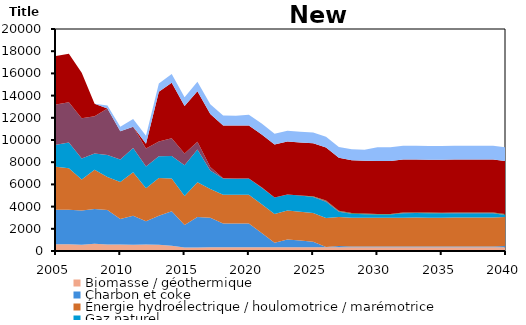
| Category | Biomasse / géothermique | Charbon et coke | Énergie hydroélectrique / houlomotrice / marémotrice | Gaz naturel | Pétrole | Solaire | Uranium | Éolien |
|---|---|---|---|---|---|---|---|---|
| 2005.0 | 610 | 3101.052 | 3875 | 1980 | 3622.764 | 0 | 4378 | 0 |
| 2006.0 | 610 | 3107.928 | 3731 | 2332 | 3622.788 | 0 | 4366 | 0 |
| 2007.0 | 562 | 3093.977 | 2793.761 | 1876 | 3622.739 | 0 | 4119 | 0 |
| 2008.0 | 647 | 3127.393 | 3536.094 | 1483 | 3341.973 | 0 | 1129 | 0 |
| 2009.0 | 576 | 3123.341 | 2964.241 | 1974 | 4200.748 | 0 | 0 | 270 |
| 2010.0 | 585 | 2308.09 | 3325.349 | 2035 | 2546.01 | 0 | 0 | 389 |
| 2011.0 | 569 | 2613.65 | 3921.287 | 2177 | 1910.48 | 0 | 0 | 693 |
| 2012.0 | 579 | 2110.213 | 2957.281 | 1967 | 1629.301 | 0 | 409 | 733 |
| 2013.0 | 558 | 2612.516 | 3410.312 | 1966 | 1323.384 | 0 | 4479 | 737 |
| 2014.0 | 474.7 | 3100.204 | 2963.114 | 2016.2 | 1592.595 | 0 | 5012.22 | 785.85 |
| 2015.0 | 307 | 2036.389 | 2615.121 | 2762.5 | 1070.912 | 0 | 4277.036 | 792.082 |
| 2016.0 | 326.2 | 2733.137 | 3133.632 | 2949 | 702.563 | 0 | 4544.84 | 856.274 |
| 2017.0 | 340.1 | 2657.768 | 2597.612 | 1652.6 | 316.133 | 0 | 4770.25 | 891.827 |
| 2018.0 | 340.1 | 2138.763 | 2597.624 | 1455.302 | 11.216 | 0 | 4770.258 | 891.833 |
| 2019.0 | 340.1 | 2138.604 | 2597.607 | 1443.877 | 9.991 | 0 | 4770.258 | 891.825 |
| 2020.0 | 340.1 | 2138.604 | 2597.618 | 1444.828 | 9.991 | 0 | 4770.258 | 973.999 |
| 2021.0 | 340.1 | 1282.684 | 2597.605 | 1469.422 | 45.044 | 0 | 4770.258 | 973.992 |
| 2022.0 | 340.1 | 406.191 | 2597.597 | 1469.417 | 10.331 | 0 | 4770.258 | 973.989 |
| 2023.0 | 340.1 | 705.648 | 2597.624 | 1447.837 | 6.12 | 0 | 4770.258 | 974.002 |
| 2024.0 | 340.1 | 608.813 | 2597.604 | 1448.112 | 5.776 | 0 | 4770.258 | 973.992 |
| 2025.0 | 340.1 | 496.887 | 2597.618 | 1440.127 | 4.161 | 52.56 | 4770.258 | 973.999 |
| 2026.0 | 340.1 | 28.464 | 2597.604 | 1480.47 | 51.349 | 52.56 | 4770.258 | 973.992 |
| 2027.0 | 340.1 | 120.623 | 2597.6 | 484.594 | 29.457 | 52.56 | 4770.258 | 973.989 |
| 2028.0 | 340.1 | 68.751 | 2597.627 | 348.388 | 5.075 | 52.56 | 4770.258 | 974.004 |
| 2029.0 | 340.1 | 68.435 | 2597.594 | 306.635 | 2.639 | 52.56 | 4770.258 | 973.987 |
| 2030.0 | 340.1 | 68.435 | 2597.598 | 272.324 | 2.639 | 52.56 | 4770.258 | 1236.786 |
| 2031.0 | 340.1 | 68.435 | 2597.624 | 276.579 | 2.639 | 52.56 | 4770.258 | 1236.806 |
| 2032.0 | 340.1 | 68.857 | 2597.624 | 396.838 | 13.286 | 52.56 | 4770.258 | 1236.801 |
| 2033.0 | 340.1 | 69.069 | 2597.609 | 406.186 | 13.541 | 52.56 | 4770.258 | 1236.793 |
| 2034.0 | 340.1 | 68.91 | 2597.597 | 387.844 | 11.836 | 52.56 | 4770.258 | 1236.787 |
| 2035.0 | 340.1 | 68.91 | 2597.625 | 385.041 | 11.318 | 52.56 | 4770.258 | 1236.803 |
| 2036.0 | 340.1 | 69.069 | 2597.593 | 400.381 | 11.796 | 52.56 | 4770.258 | 1236.785 |
| 2037.0 | 340.1 | 69.069 | 2597.605 | 397.361 | 10.972 | 52.56 | 4770.258 | 1236.792 |
| 2038.0 | 340.1 | 69.069 | 2597.62 | 394.263 | 15.148 | 52.56 | 4770.258 | 1236.801 |
| 2039.0 | 340.1 | 69.069 | 2597.595 | 391.127 | 22.317 | 58.692 | 4770.258 | 1236.786 |
| 2040.0 | 340.1 | 120.255 | 2597.619 | 161.62 | 41.596 | 64.824 | 4770.258 | 1236.8 |